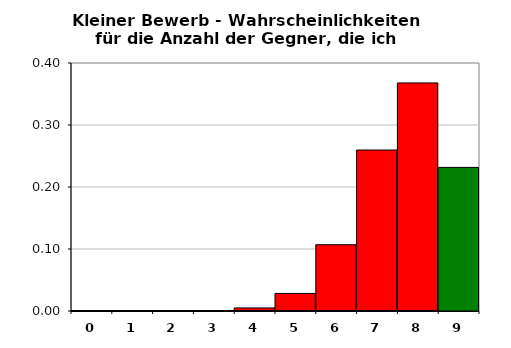
| Category | do not get the prize | 0,85 | 9 | 0,2316 |
|---|---|---|---|---|
| 0.0 | 0 | 0 | 0 | -1 |
| 1.0 | 0 | 0 | 0 | -1 |
| 2.0 | 0 | 0 | 0 | -1 |
| 3.0 | 0.001 | 0 | 0 | -1 |
| 4.0 | 0.005 | 0 | 0 | -1 |
| 5.0 | 0.028 | 0 | 0 | -1 |
| 6.0 | 0.107 | 0 | 0 | -1 |
| 7.0 | 0.26 | 0 | 0 | -1 |
| 8.0 | 0.368 | 0 | 0 | -1 |
| 9.0 | -1 | 0 | 0 | 0.232 |